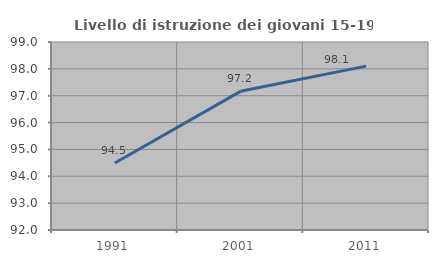
| Category | Livello di istruzione dei giovani 15-19 anni |
|---|---|
| 1991.0 | 94.495 |
| 2001.0 | 97.163 |
| 2011.0 | 98.101 |